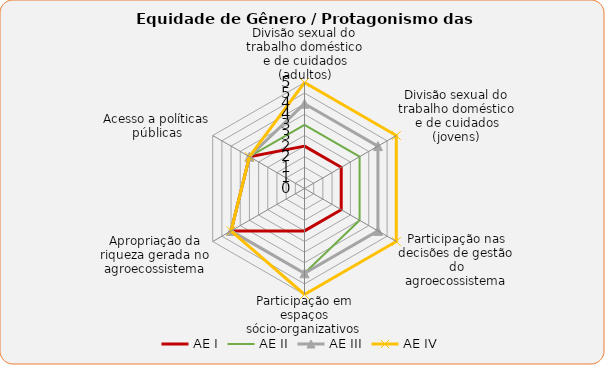
| Category | AE I | AE II | AE III | AE IV |
|---|---|---|---|---|
| Divisão sexual do trabalho doméstico e de cuidados (adultos) | 2 | 3 | 4 | 5 |
| Divisão sexual do trabalho doméstico e de cuidados (jovens) | 2 | 3 | 4 | 5 |
| Participação nas decisões de gestão do agroecossistema | 2 | 3 | 4 | 5 |
| Participação em espaços sócio-organizativos | 2 | 4 | 4 | 5 |
| Apropriação da riqueza gerada no agroecossistema | 4 | 4 | 4 | 4 |
| Acesso a políticas públicas | 3 | 3 | 3 | 3 |